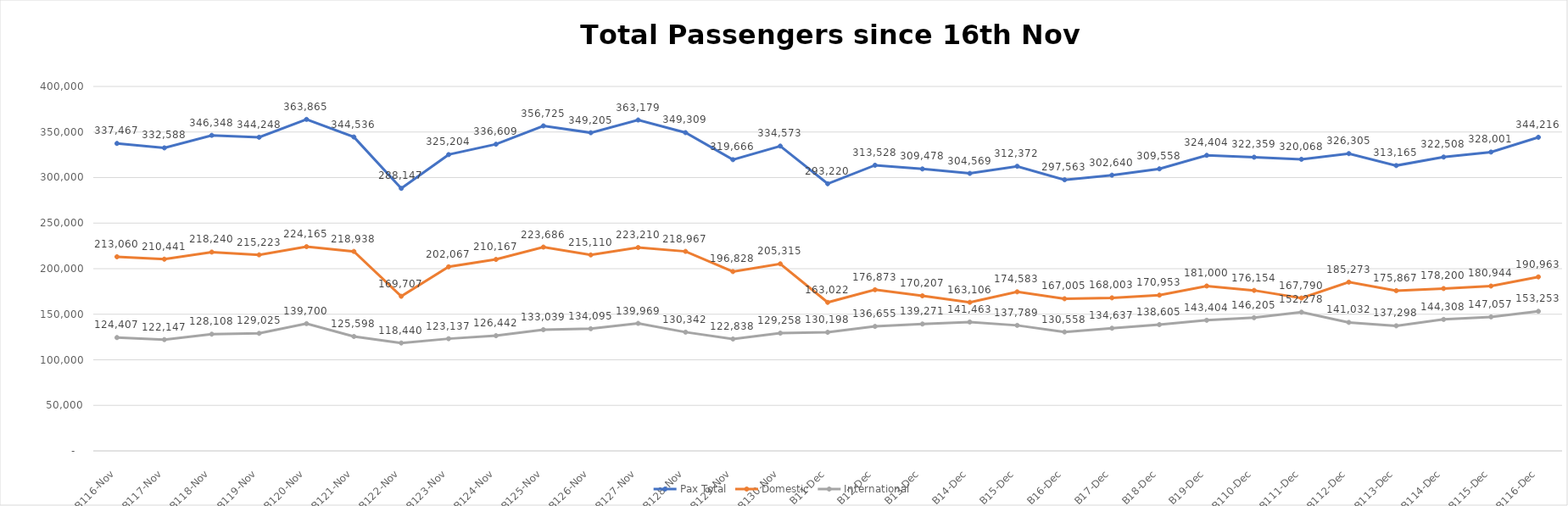
| Category | Pax Total |  Domestic  |  International  |
|---|---|---|---|
| 2022-11-16 | 337467 | 213060 | 124407 |
| 2022-11-17 | 332588 | 210441 | 122147 |
| 2022-11-18 | 346348 | 218240 | 128108 |
| 2022-11-19 | 344248 | 215223 | 129025 |
| 2022-11-20 | 363865 | 224165 | 139700 |
| 2022-11-21 | 344536 | 218938 | 125598 |
| 2022-11-22 | 288147 | 169707 | 118440 |
| 2022-11-23 | 325204 | 202067 | 123137 |
| 2022-11-24 | 336609 | 210167 | 126442 |
| 2022-11-25 | 356725 | 223686 | 133039 |
| 2022-11-26 | 349205 | 215110 | 134095 |
| 2022-11-27 | 363179 | 223210 | 139969 |
| 2022-11-28 | 349309 | 218967 | 130342 |
| 2022-11-29 | 319666 | 196828 | 122838 |
| 2022-11-30 | 334573 | 205315 | 129258 |
| 2022-12-01 | 293220 | 163022 | 130198 |
| 2022-12-02 | 313528 | 176873 | 136655 |
| 2022-12-03 | 309478 | 170207 | 139271 |
| 2022-12-04 | 304569 | 163106 | 141463 |
| 2022-12-05 | 312372 | 174583 | 137789 |
| 2022-12-06 | 297563 | 167005 | 130558 |
| 2022-12-07 | 302640 | 168003 | 134637 |
| 2022-12-08 | 309558 | 170953 | 138605 |
| 2022-12-09 | 324404 | 181000 | 143404 |
| 2022-12-10 | 322359 | 176154 | 146205 |
| 2022-12-11 | 320068 | 167790 | 152278 |
| 2022-12-12 | 326305 | 185273 | 141032 |
| 2022-12-13 | 313165 | 175867 | 137298 |
| 2022-12-14 | 322508 | 178200 | 144308 |
| 2022-12-15 | 328001 | 180944 | 147057 |
| 2022-12-16 | 344216 | 190963 | 153253 |